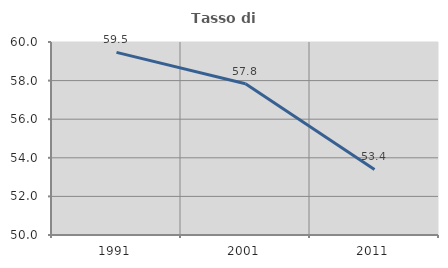
| Category | Tasso di occupazione   |
|---|---|
| 1991.0 | 59.464 |
| 2001.0 | 57.836 |
| 2011.0 | 53.394 |